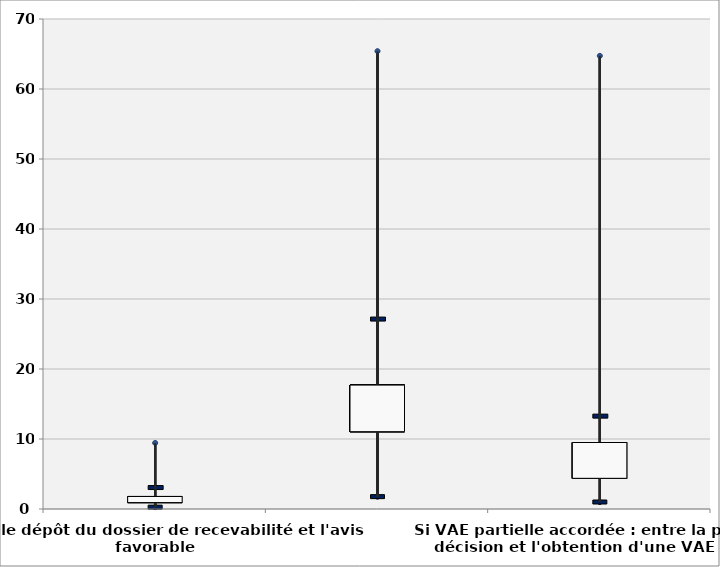
| Category | Series 0 | Series 1 | Series 2 | Series 3 | Series 4 | Series 5 | Series 6 | Series 7 |
|---|---|---|---|---|---|---|---|---|
| Entre le dépôt du dossier de recevabilité et l'avis favorable | 0.917 | 0.267 | 0.267 | 1.267 | 1.704 | 3.067 | 9.433 | 1.787 |
| Entre l'avis favorable de recevabilité et l'examen du dossier par le jury de VAE   | 11.045 | 1.767 | 1.767 | 13.955 | 15.801 | 27.133 | 65.4 | 17.699 |
| Si VAE partielle accordée : entre la première décision et l'obtention d'une VAE totale | 4.383 | 1 | 1 | 6.067 | 8.726 | 13.267 | 64.733 | 9.5 |